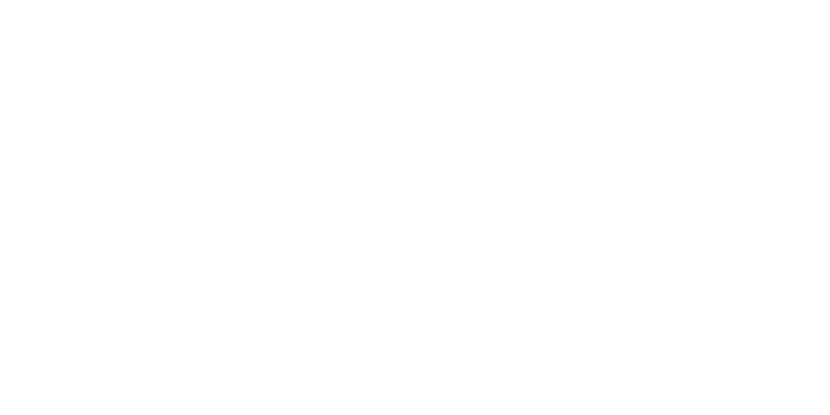
| Category | Total |
|---|---|
| Al Hodeidah | 75551 |
| Hajjah | 59252 |
| Marib | 55775 |
| Taiz | 17504 |
| Al Jawf | 12878 |
| Sadah | 7223 |
| Abyan | 6655 |
| Amran | 4910 |
| Sanaa | 4299 |
| Lahj | 4272 |
| Aden | 3703 |
| Hadramawt | 3250 |
| Ad Dali | 2962 |
| Ibb | 2741 |
| Dhamar | 2228 |
| Al Bayda | 1995 |
| Shabwah | 1249 |
| Al Mahwit | 680 |
| Sanaa City | 553 |
| Al Maharah | 353 |
| Raymah | 197 |
| Socotra | 15 |